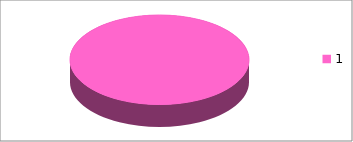
| Category | Series 0 |
|---|---|
| 0 | 10 |
| 1 | 0 |